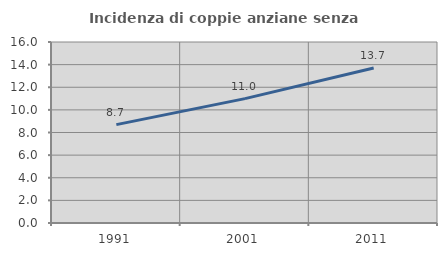
| Category | Incidenza di coppie anziane senza figli  |
|---|---|
| 1991.0 | 8.694 |
| 2001.0 | 10.997 |
| 2011.0 | 13.703 |